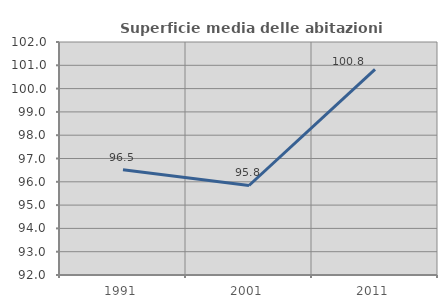
| Category | Superficie media delle abitazioni occupate |
|---|---|
| 1991.0 | 96.516 |
| 2001.0 | 95.842 |
| 2011.0 | 100.822 |